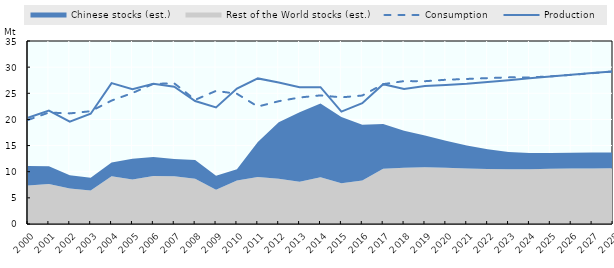
| Category | Production | Consumption |
|---|---|---|
| 2000.0 | 20.31 | 19.895 |
| 2001.0 | 21.686 | 21.318 |
| 2002.0 | 19.581 | 21.154 |
| 2003.0 | 21.093 | 21.569 |
| 2004.0 | 26.953 | 23.609 |
| 2005.0 | 25.789 | 25.053 |
| 2006.0 | 26.839 | 26.805 |
| 2007.0 | 26.269 | 26.906 |
| 2008.0 | 23.51 | 23.749 |
| 2009.0 | 22.292 | 25.459 |
| 2010.0 | 25.891 | 24.903 |
| 2011.0 | 27.847 | 22.462 |
| 2012.0 | 27.05 | 23.482 |
| 2013.0 | 26.163 | 24.195 |
| 2014.0 | 26.173 | 24.598 |
| 2015.0 | 21.489 | 24.219 |
| 2016.0 | 23.098 | 24.57 |
| 2017.0 | 26.742 | 26.743 |
| 2018.0 | 25.843 | 27.333 |
| 2019.0 | 26.407 | 27.311 |
| 2020.0 | 26.595 | 27.589 |
| 2021.0 | 26.84 | 27.739 |
| 2022.0 | 27.176 | 27.902 |
| 2023.0 | 27.513 | 28.045 |
| 2024.0 | 27.863 | 28.036 |
| 2025.0 | 28.233 | 28.238 |
| 2026.0 | 28.565 | 28.53 |
| 2027.0 | 28.879 | 28.834 |
| 2028.0 | 29.189 | 29.176 |